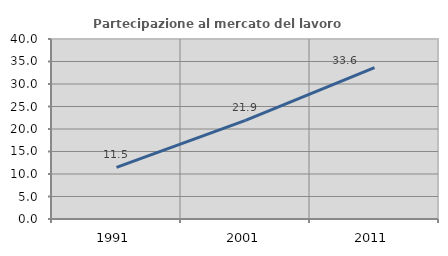
| Category | Partecipazione al mercato del lavoro  femminile |
|---|---|
| 1991.0 | 11.489 |
| 2001.0 | 21.918 |
| 2011.0 | 33.636 |